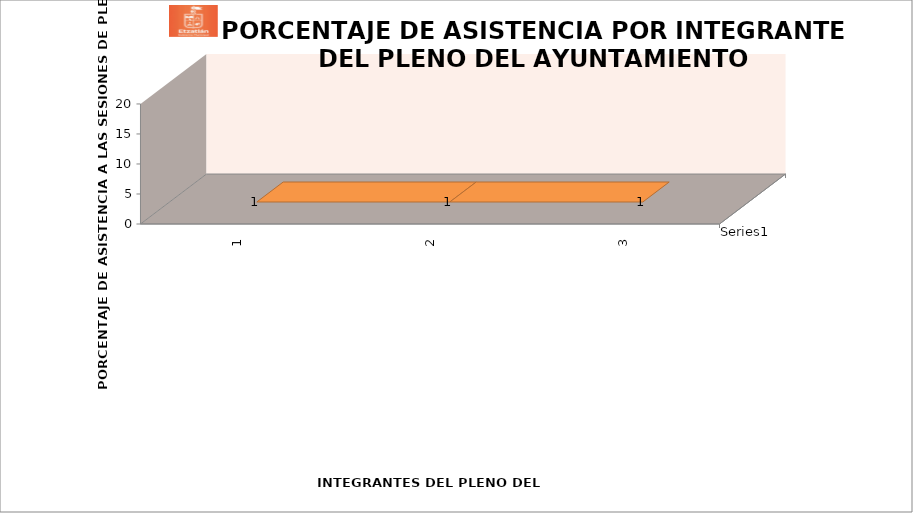
| Category | Series 0 |
|---|---|
| 0 | 1 |
| 1 | 1 |
| 2 | 1 |